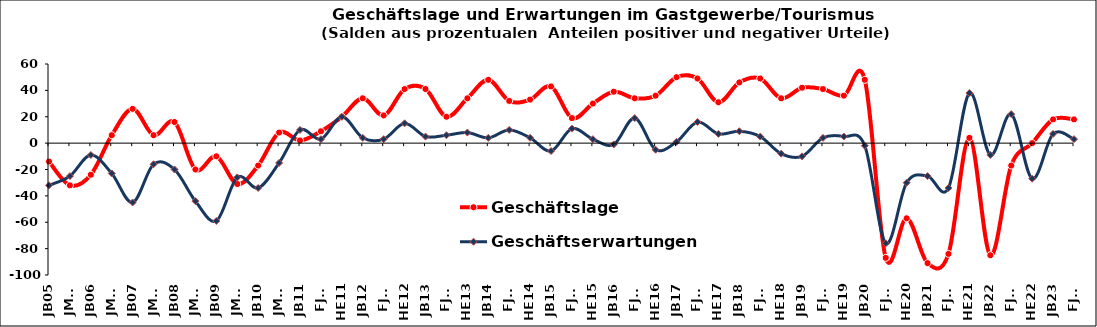
| Category | Geschäftslage | Geschäftserwartungen |
|---|---|---|
| JB05 | -14 | -32 |
| JM05 | -32 | -25 |
| JB06 | -24 | -9 |
| JM06 | 6 | -23 |
| JB07 | 26 | -45 |
| JM07 | 6 | -16 |
| JB08 | 16 | -20 |
| JM08 | -20 | -44 |
| JB09 | -10 | -59 |
| JM09 | -31 | -26 |
| JB10 | -17 | -34 |
| JM10 | 8 | -15 |
| JB11 | 2 | 10 |
| FJ11 | 9 | 3 |
| HE11 | 20 | 20 |
| JB12 | 34 | 4 |
| FJ12 | 21 | 3 |
| HE12 | 41 | 15 |
| JB13 | 41 | 5 |
| FJ13 | 20 | 6 |
| HE13 | 34 | 8 |
| JB14 | 48 | 4 |
| FJ14 | 32 | 10 |
| HE14 | 33 | 4 |
| JB15 | 43 | -6 |
| FJ15 | 19 | 11 |
| HE15 | 30 | 3 |
| JB16 | 39 | -1 |
| FJ16 | 34 | 19 |
| HE16 | 36 | -5 |
| JB17 | 50 | 1 |
| FJ17 | 49 | 16 |
| HE17 | 31 | 7 |
| JB18 | 46 | 9 |
| FJ18 | 49 | 5 |
| HE18 | 34 | -8 |
| JB19 | 42 | -10 |
| FJ19 | 41 | 4 |
| HE19 | 36 | 5 |
| JB20 | 48 | -2 |
| FJ20 | -87 | -76 |
| HE20 | -57 | -30 |
| JB21 | -91 | -25 |
| FJ21 | -84 | -34 |
| HE21 | 4 | 38 |
| JB22 | -85 | -9 |
| FJ22 | -17 | 22 |
| HE22 | 0 | -27 |
| JB23 | 18 | 7 |
| FJ23 | 18 | 3 |